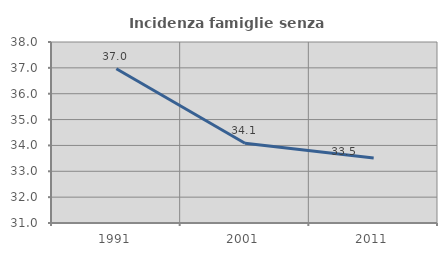
| Category | Incidenza famiglie senza nuclei |
|---|---|
| 1991.0 | 36.963 |
| 2001.0 | 34.085 |
| 2011.0 | 33.512 |